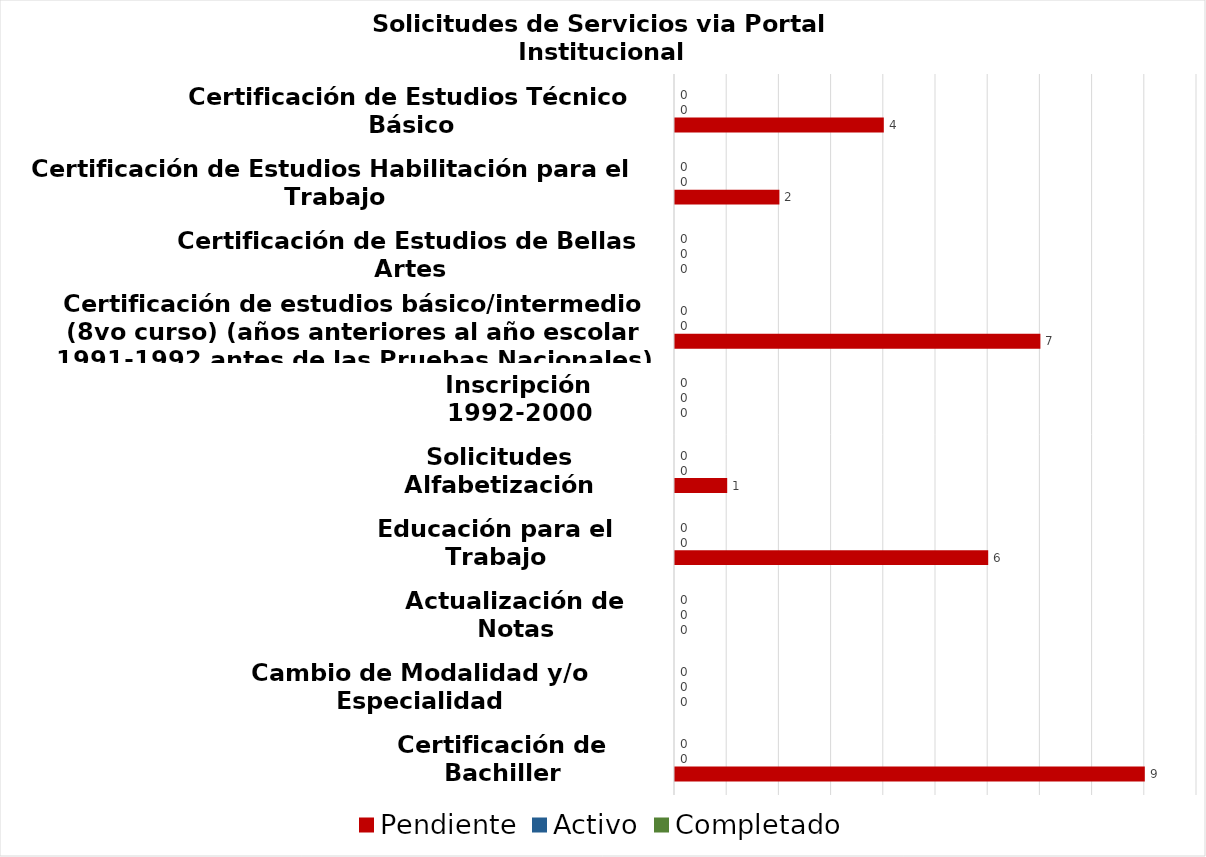
| Category | Pendiente | Activo | Completado |
|---|---|---|---|
| Certificación de Bachiller | 9 | 0 | 0 |
| Cambio de Modalidad y/o Especialidad | 0 | 0 | 0 |
| Actualización de Notas | 0 | 0 | 0 |
| Educación para el Trabajo | 6 | 0 | 0 |
| Solicitudes Alfabetización | 1 | 0 | 0 |
| Inscripción 1992-2000 | 0 | 0 | 0 |
| Certificación de estudios básico/intermedio (8vo curso) (años anteriores al año escolar 1991-1992 antes de las Pruebas Nacionales) | 7 | 0 | 0 |
| Certificación de Estudios de Bellas Artes | 0 | 0 | 0 |
| Certificación de Estudios Habilitación para el Trabajo | 2 | 0 | 0 |
| Certificación de Estudios Técnico Básico | 4 | 0 | 0 |